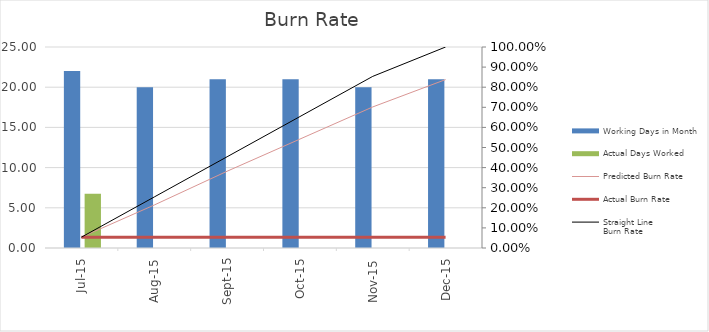
| Category | Working Days in Month | Actual Days Worked |
|---|---|---|
| 2015-07-01 | 22 | 6.733 |
| 2015-08-01 | 20 | 0 |
| 2015-09-01 | 21 | 0 |
| 2015-10-01 | 21 | 0 |
| 2015-11-01 | 20 | 0 |
| 2015-12-01 | 21 | 0 |